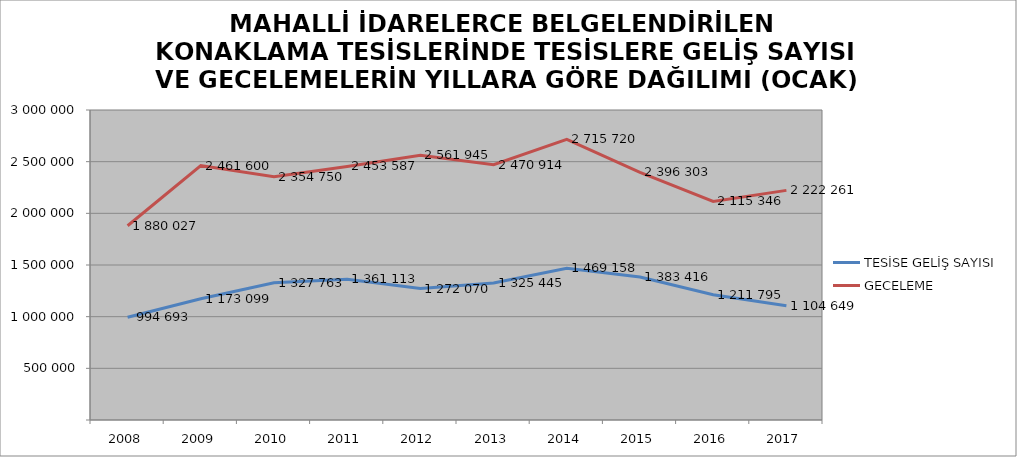
| Category | TESİSE GELİŞ SAYISI | GECELEME |
|---|---|---|
| 2008 | 994693 | 1880027 |
| 2009 | 1173099 | 2461600 |
| 2010 | 1327763 | 2354750 |
| 2011 | 1361113 | 2453587 |
| 2012 | 1272070 | 2561945 |
| 2013 | 1325445 | 2470914 |
| 2014 | 1469158 | 2715720 |
| 2015 | 1383416 | 2396303 |
| 2016 | 1211795 | 2115346 |
| 2017 | 1104649 | 2222261 |